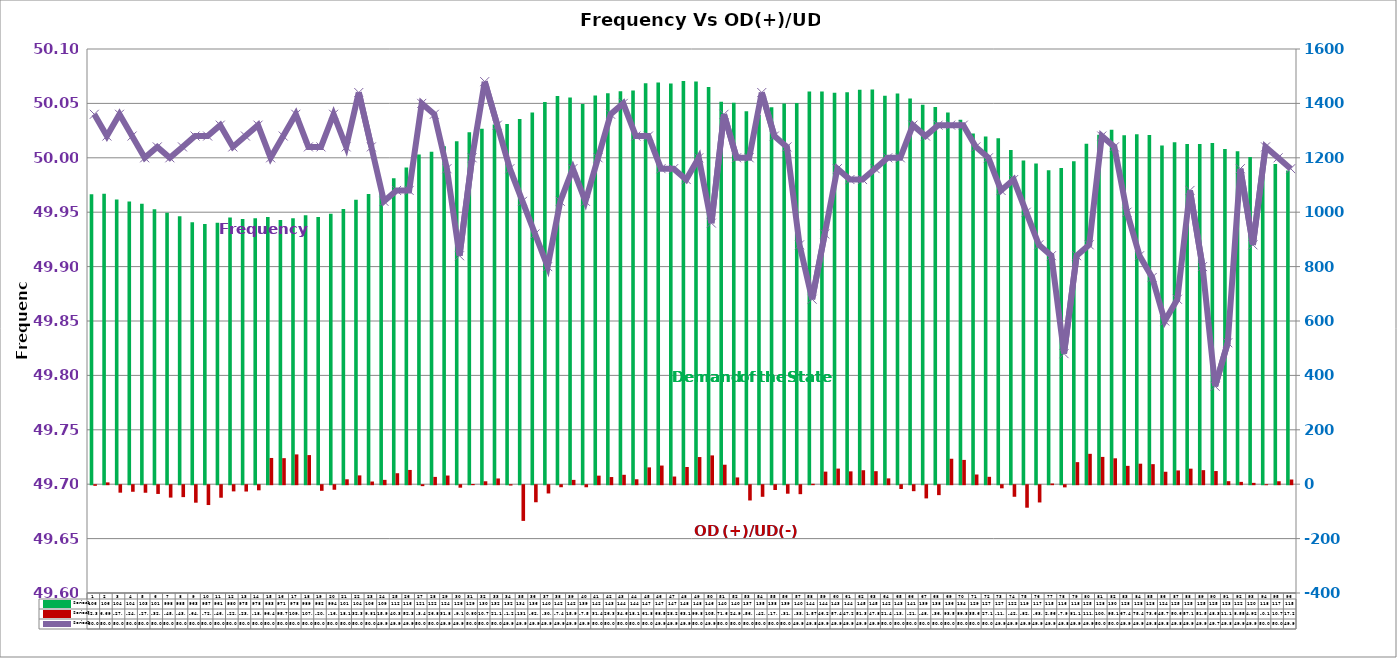
| Category | Series 2 | Series 4 |
|---|---|---|
| 0 | 1065.58 | -2.32 |
| 1 | 1067.55 | 6.69 |
| 2 | 1047.04 | -27.47 |
| 3 | 1039.57 | -24.16 |
| 4 | 1030.78 | -27.75 |
| 5 | 1011.24 | -32.16 |
| 6 | 997.73 | -45.57 |
| 7 | 984.68 | -43.82 |
| 8 | 962.62 | -64.3 |
| 9 | 956.7 | -72.93 |
| 10 | 960.76 | -46.04 |
| 11 | 980.2 | -22.75 |
| 12 | 975.1 | -23.27 |
| 13 | 977.62 | -18.82 |
| 14 | 982.58 | 96.44 |
| 15 | 970.91 | 95.73 |
| 16 | 977.52 | 109.53 |
| 17 | 988.84 | 107.05 |
| 18 | 982.45 | -20.61 |
| 19 | 994.47 | -16.77 |
| 20 | 1011.78 | 18.13 |
| 21 | 1045.99 | 32.39 |
| 22 | 1066.7 | 9.81 |
| 23 | 1096.84 | 15.94 |
| 24 | 1125.24 | 40.36 |
| 25 | 1164.16 | 52.38 |
| 26 | 1211.76 | -3.43 |
| 27 | 1222.03 | 26.83 |
| 28 | 1242.49 | 31.89 |
| 29 | 1261.25 | -9.16 |
| 30 | 1293.5 | 0.8 |
| 31 | 1307.19 | 10.78 |
| 32 | 1322.87 | 21.1 |
| 33 | 1323.89 | -1.28 |
| 34 | 1342.43 | -131.24 |
| 35 | 1366.13 | -62.72 |
| 36 | 1405.13 | -30.35 |
| 37 | 1427.36 | -7.45 |
| 38 | 1421.38 | 15.9 |
| 39 | 1397.59 | -7.58 |
| 40 | 1429.36 | 31.44 |
| 41 | 1437.39 | 26.32 |
| 42 | 1444.6 | 34.6 |
| 43 | 1447.45 | 18.19 |
| 44 | 1473.63 | 61.82 |
| 45 | 1476.95 | 68.58 |
| 46 | 1473.23 | 28.2 |
| 47 | 1481.92 | 63.17 |
| 48 | 1480.46 | 99.84 |
| 49 | 1460.64 | 105.89 |
| 50 | 1405.9 | 71.63 |
| 51 | 1402.36 | 24.91 |
| 52 | 1371.29 | -56.17 |
| 53 | 1357.18 | -42.64 |
| 54 | 1385.79 | -17.67 |
| 55 | 1399.31 | -31.28 |
| 56 | 1401.51 | -33 |
| 57 | 1444.08 | 1.57 |
| 58 | 1443.88 | 46.26 |
| 59 | 1439.31 | 57.43 |
| 60 | 1441.05 | 47.21 |
| 61 | 1450.48 | 51.32 |
| 62 | 1451.41 | 47.89 |
| 63 | 1427.74 | 21.4 |
| 64 | 1436.5 | -13.88 |
| 65 | 1418.13 | -21.99 |
| 66 | 1395.43 | -48.54 |
| 67 | 1386.88 | -36.53 |
| 68 | 1366.95 | 93.57 |
| 69 | 1340.08 | 89.32 |
| 70 | 1289.54 | 35.66 |
| 71 | 1278.68 | 27.16 |
| 72 | 1272.13 | -11.46 |
| 73 | 1229.09 | -42.55 |
| 74 | 1190.17 | -82.75 |
| 75 | 1179.21 | -63.45 |
| 76 | 1154.45 | 2.56 |
| 77 | 1162.57 | -7.99 |
| 78 | 1186.99 | 81.11 |
| 79 | 1251.99 | 111.68 |
| 80 | 1284.88 | 100.31 |
| 81 | 1303.09 | 95.19 |
| 82 | 1283.3 | 67.44 |
| 83 | 1286.25 | 75.4 |
| 84 | 1283.84 | 73.69 |
| 85 | 1245.54 | 45.75 |
| 86 | 1257.1 | 50.6 |
| 87 | 1250.32 | 57.14 |
| 88 | 1250.95 | 51.59 |
| 89 | 1254.23 | 48.36 |
| 90 | 1232.29 | 11.1 |
| 91 | 1224.3 | 8.55 |
| 92 | 1203 | 4.92 |
| 93 | 1185.06 | -0.17 |
| 94 | 1176.92 | 10.77 |
| 95 | 1152.99 | 17.25 |